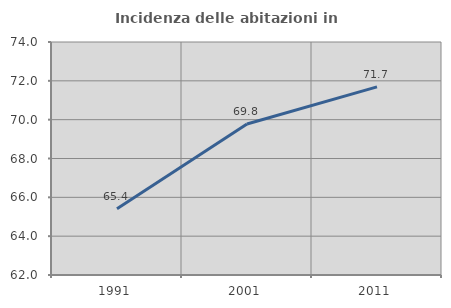
| Category | Incidenza delle abitazioni in proprietà  |
|---|---|
| 1991.0 | 65.408 |
| 2001.0 | 69.779 |
| 2011.0 | 71.69 |